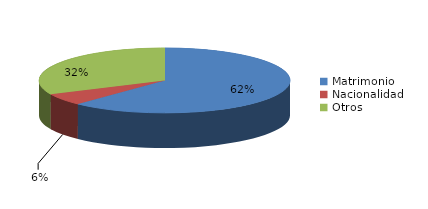
| Category | Series 0 |
|---|---|
| Matrimonio | 1292 |
| Nacionalidad | 123 |
| Otros | 665 |